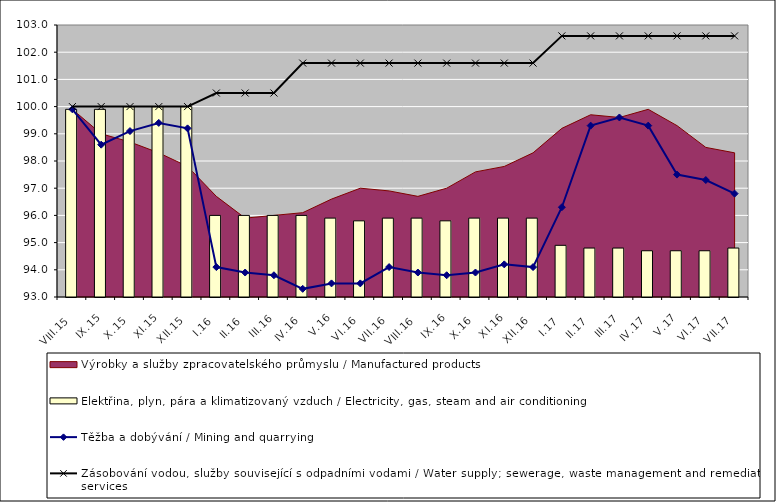
| Category | Elektřina, plyn, pára a klimatizovaný vzduch / Electricity, gas, steam and air conditioning |
|---|---|
| VIII.15 | 99.9 |
| IX.15 | 99.9 |
| X.15 | 100 |
| XI.15 | 100 |
| XII.15 | 100 |
| I.16 | 96 |
| II.16 | 96 |
| III.16 | 96 |
| IV.16 | 96 |
| V.16 | 95.9 |
| VI.16 | 95.8 |
| VII.16 | 95.9 |
| VIII.16 | 95.9 |
| IX.16 | 95.8 |
| X.16 | 95.9 |
| XI.16 | 95.9 |
| XII.16 | 95.9 |
| I.17 | 94.9 |
| II.17 | 94.8 |
| III.17 | 94.8 |
| IV.17 | 94.7 |
| V.17 | 94.7 |
| VI.17 | 94.7 |
| VII.17 | 94.8 |